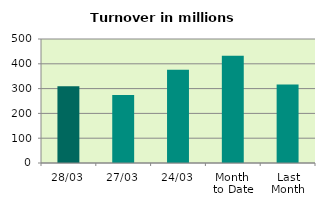
| Category | Series 0 |
|---|---|
| 28/03 | 309.958 |
| 27/03 | 273.893 |
| 24/03 | 375.856 |
| Month 
to Date | 432.048 |
| Last
Month | 316.082 |